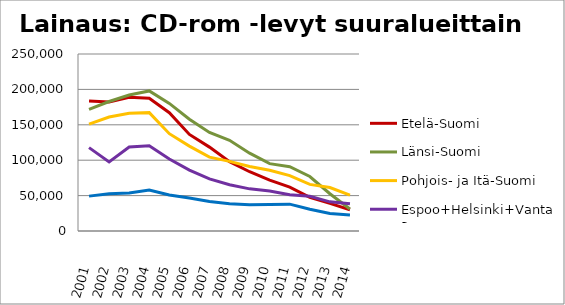
| Category | Etelä-Suomi | Länsi-Suomi | Pohjois- ja Itä-Suomi | Espoo+Helsinki+Vantaa | Muu Uusimaa |
|---|---|---|---|---|---|
| 2001.0 | 183576 | 171712 | 150953 | 117786 | 49261 |
| 2002.0 | 182378 | 182899 | 161025 | 97595 | 52556 |
| 2003.0 | 188767 | 192157 | 166336 | 118589 | 53594 |
| 2004.0 | 187502 | 197804 | 167178 | 120420 | 57884 |
| 2005.0 | 167102 | 180247 | 137465 | 101738 | 50949 |
| 2006.0 | 136376 | 157836 | 119886 | 86053 | 46460 |
| 2007.0 | 118481 | 139142 | 104338 | 73557 | 41577 |
| 2008.0 | 97987 | 128117 | 98384 | 65428 | 38628 |
| 2009.0 | 83673 | 109918 | 91152 | 59529 | 37236 |
| 2010.0 | 71974 | 95173 | 85769 | 56476 | 37434 |
| 2011.0 | 62025 | 90780 | 78272 | 51360 | 37924 |
| 2012.0 | 47562 | 76954 | 65805 | 49018 | 30636 |
| 2013.0 | 39061 | 52633 | 61459 | 41172 | 24603 |
| 2014.0 | 30003 | 31107 | 50666 | 38363 | 22617 |